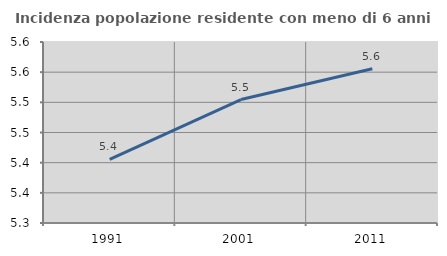
| Category | Incidenza popolazione residente con meno di 6 anni |
|---|---|
| 1991.0 | 5.405 |
| 2001.0 | 5.505 |
| 2011.0 | 5.556 |